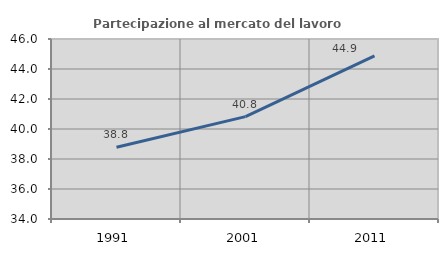
| Category | Partecipazione al mercato del lavoro  femminile |
|---|---|
| 1991.0 | 38.782 |
| 2001.0 | 40.825 |
| 2011.0 | 44.876 |